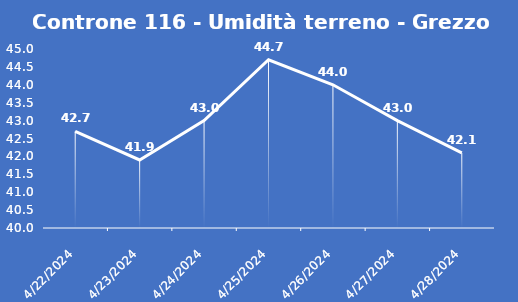
| Category | Controne 116 - Umidità terreno - Grezzo (%VWC) |
|---|---|
| 4/22/24 | 42.7 |
| 4/23/24 | 41.9 |
| 4/24/24 | 43 |
| 4/25/24 | 44.7 |
| 4/26/24 | 44 |
| 4/27/24 | 43 |
| 4/28/24 | 42.1 |